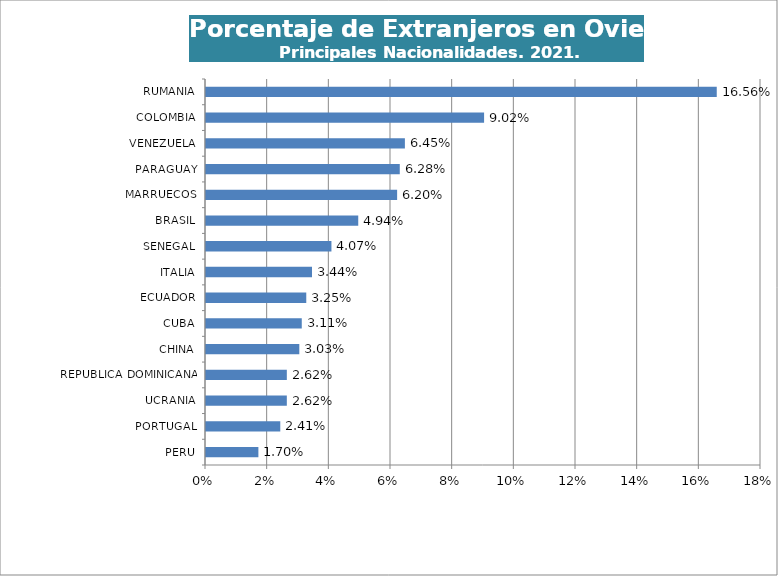
| Category | Series 0 |
|---|---|
| PERU | 0.017 |
| PORTUGAL | 0.024 |
| UCRANIA | 0.026 |
| REPUBLICA DOMINICANA | 0.026 |
| CHINA | 0.03 |
| CUBA | 0.031 |
| ECUADOR | 0.033 |
| ITALIA | 0.034 |
| SENEGAL | 0.041 |
| BRASIL | 0.049 |
| MARRUECOS | 0.062 |
| PARAGUAY | 0.063 |
| VENEZUELA | 0.065 |
| COLOMBIA | 0.09 |
| RUMANIA | 0.166 |